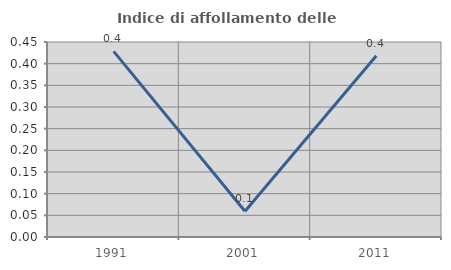
| Category | Indice di affollamento delle abitazioni  |
|---|---|
| 1991.0 | 0.428 |
| 2001.0 | 0.06 |
| 2011.0 | 0.418 |